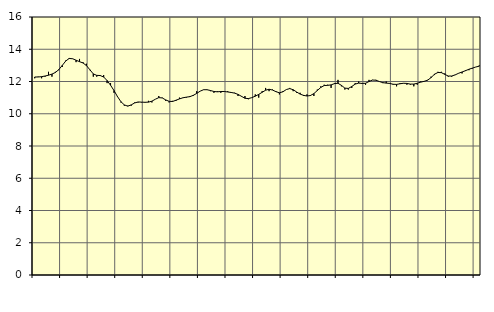
| Category | Piggar | Handel, SNI 45-47 |
|---|---|---|
| nan | 12.2 | 12.28 |
| 87.0 | 12.3 | 12.28 |
| 87.0 | 12.2 | 12.3 |
| 87.0 | 12.3 | 12.34 |
| nan | 12.6 | 12.39 |
| 88.0 | 12.3 | 12.46 |
| 88.0 | 12.6 | 12.56 |
| 88.0 | 12.7 | 12.74 |
| nan | 12.9 | 13 |
| 89.0 | 13.3 | 13.27 |
| 89.0 | 13.4 | 13.43 |
| 89.0 | 13.4 | 13.41 |
| nan | 13.2 | 13.32 |
| 90.0 | 13.4 | 13.23 |
| 90.0 | 13.2 | 13.15 |
| 90.0 | 13.1 | 12.99 |
| nan | 12.7 | 12.73 |
| 91.0 | 12.3 | 12.47 |
| 91.0 | 12.3 | 12.38 |
| 91.0 | 12.4 | 12.37 |
| nan | 12.4 | 12.28 |
| 92.0 | 11.9 | 12.06 |
| 92.0 | 11.9 | 11.77 |
| 92.0 | 11.3 | 11.44 |
| nan | 11.1 | 11.07 |
| 93.0 | 10.7 | 10.75 |
| 93.0 | 10.5 | 10.55 |
| 93.0 | 10.5 | 10.47 |
| nan | 10.5 | 10.55 |
| 94.0 | 10.7 | 10.67 |
| 94.0 | 10.7 | 10.73 |
| 94.0 | 10.7 | 10.72 |
| nan | 10.7 | 10.71 |
| 95.0 | 10.8 | 10.72 |
| 95.0 | 10.7 | 10.78 |
| 95.0 | 10.9 | 10.9 |
| nan | 11.1 | 11 |
| 96.0 | 11 | 10.98 |
| 96.0 | 10.8 | 10.86 |
| 96.0 | 10.7 | 10.77 |
| nan | 10.8 | 10.76 |
| 97.0 | 10.8 | 10.84 |
| 97.0 | 11 | 10.92 |
| 97.0 | 11 | 10.99 |
| nan | 11 | 11.03 |
| 98.0 | 11.1 | 11.06 |
| 98.0 | 11.1 | 11.14 |
| 98.0 | 11.4 | 11.26 |
| nan | 11.4 | 11.4 |
| 99.0 | 11.5 | 11.49 |
| 99.0 | 11.5 | 11.49 |
| 99.0 | 11.4 | 11.44 |
| nan | 11.3 | 11.38 |
| 0.0 | 11.4 | 11.36 |
| 0.0 | 11.3 | 11.38 |
| 0.0 | 11.4 | 11.38 |
| nan | 11.4 | 11.35 |
| 1.0 | 11.3 | 11.32 |
| 1.0 | 11.3 | 11.28 |
| 1.0 | 11.1 | 11.2 |
| nan | 11.1 | 11.08 |
| 2.0 | 11.1 | 10.96 |
| 2.0 | 10.9 | 10.94 |
| 2.0 | 11 | 11 |
| nan | 11.2 | 11.09 |
| 3.0 | 11 | 11.2 |
| 3.0 | 11.4 | 11.33 |
| 3.0 | 11.6 | 11.46 |
| nan | 11.4 | 11.52 |
| 4.0 | 11.5 | 11.47 |
| 4.0 | 11.4 | 11.37 |
| 4.0 | 11.2 | 11.3 |
| nan | 11.4 | 11.36 |
| 5.0 | 11.5 | 11.5 |
| 5.0 | 11.6 | 11.56 |
| 5.0 | 11.4 | 11.49 |
| nan | 11.3 | 11.35 |
| 6.0 | 11.3 | 11.22 |
| 6.0 | 11.1 | 11.14 |
| 6.0 | 11.2 | 11.1 |
| nan | 11.1 | 11.13 |
| 7.0 | 11.1 | 11.25 |
| 7.0 | 11.5 | 11.44 |
| 7.0 | 11.7 | 11.63 |
| nan | 11.8 | 11.75 |
| 8.0 | 11.8 | 11.76 |
| 8.0 | 11.6 | 11.79 |
| 8.0 | 11.9 | 11.87 |
| nan | 12.1 | 11.89 |
| 9.0 | 11.7 | 11.76 |
| 9.0 | 11.5 | 11.59 |
| 9.0 | 11.5 | 11.57 |
| nan | 11.6 | 11.69 |
| 10.0 | 11.9 | 11.84 |
| 10.0 | 12 | 11.9 |
| 10.0 | 11.9 | 11.88 |
| nan | 11.8 | 11.89 |
| 11.0 | 12.1 | 12 |
| 11.0 | 12.1 | 12.09 |
| 11.0 | 12.1 | 12.08 |
| nan | 12 | 12 |
| 12.0 | 11.9 | 11.93 |
| 12.0 | 12 | 11.9 |
| 12.0 | 11.9 | 11.88 |
| nan | 11.8 | 11.83 |
| 13.0 | 11.7 | 11.82 |
| 13.0 | 11.9 | 11.86 |
| 13.0 | 11.9 | 11.89 |
| nan | 11.8 | 11.88 |
| 14.0 | 11.8 | 11.84 |
| 14.0 | 11.7 | 11.84 |
| 14.0 | 11.8 | 11.89 |
| nan | 12 | 11.96 |
| 15.0 | 12 | 12.01 |
| 15.0 | 12.1 | 12.08 |
| 15.0 | 12.3 | 12.24 |
| nan | 12.4 | 12.45 |
| 16.0 | 12.6 | 12.56 |
| 16.0 | 12.6 | 12.55 |
| 16.0 | 12.5 | 12.44 |
| nan | 12.3 | 12.34 |
| 17.0 | 12.3 | 12.34 |
| 17.0 | 12.4 | 12.41 |
| 17.0 | 12.5 | 12.51 |
| nan | 12.5 | 12.59 |
| 18.0 | 12.7 | 12.67 |
| 18.0 | 12.7 | 12.76 |
| 18.0 | 12.8 | 12.83 |
| nan | 12.9 | 12.9 |
| 19.0 | 13 | 12.95 |